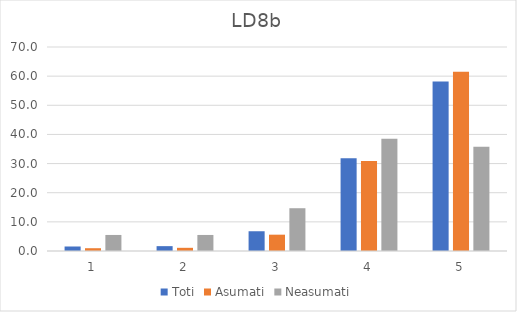
| Category | Toti | Asumati | Neasumati |
|---|---|---|---|
| 0 | 1.546 | 0.956 | 5.505 |
| 1 | 1.665 | 1.093 | 5.505 |
| 2 | 6.778 | 5.601 | 14.679 |
| 3 | 31.867 | 30.874 | 38.532 |
| 4 | 58.145 | 61.475 | 35.78 |